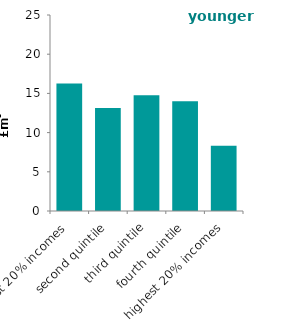
| Category | younger households |
|---|---|
| lowest 20% incomes | 16.267 |
| second quintile | 13.15 |
| third quintile | 14.756 |
| fourth quintile | 14.012 |
| highest 20% incomes | 8.332 |